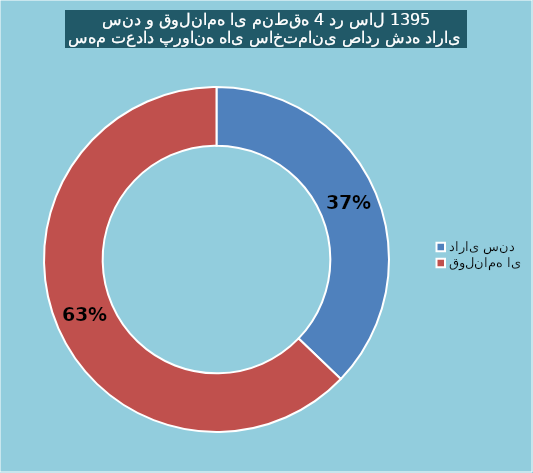
| Category | Series 0 |
|---|---|
| دارای سند | 119 |
| قولنامه ای | 201 |